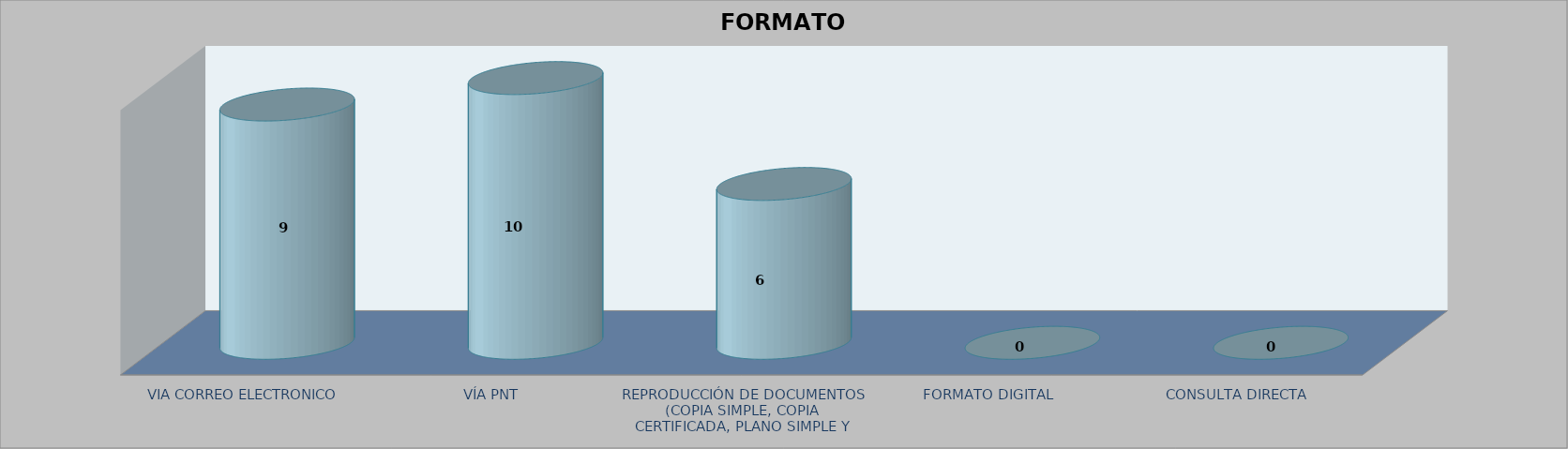
| Category |        FORMATO SOLICITADO | Series 1 | Series 2 |
|---|---|---|---|
| VIA CORREO ELECTRONICO |  |  | 9 |
| VÍA PNT |  |  | 10 |
| REPRODUCCIÓN DE DOCUMENTOS (COPIA SIMPLE, COPIA CERTIFICADA, PLANO SIMPLE Y PLANO CERTIFICADO) |  |  | 6 |
| FORMATO DIGITAL |  |  | 0 |
| CONSULTA DIRECTA |  |  | 0 |